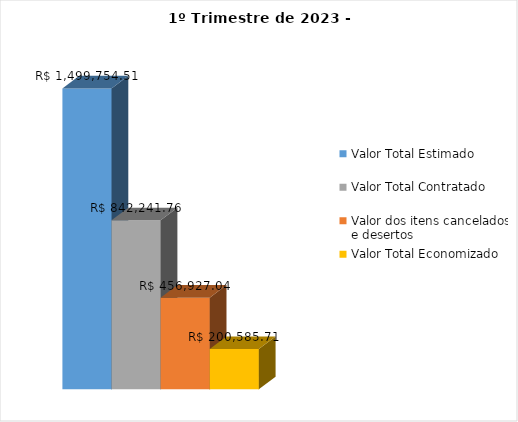
| Category | Valor Total Estimado | Valor Total Contratado | Valor dos itens cancelados e desertos | Valor Total Economizado |
|---|---|---|---|---|
| 0 | 1499754.51 | 842241.76 | 456927.04 | 200585.71 |